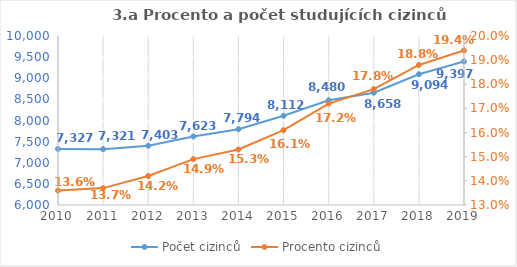
| Category | Počet cizinců |
|---|---|
| 2010.0 | 7327 |
| 2011.0 | 7321 |
| 2012.0 | 7403 |
| 2013.0 | 7623 |
| 2014.0 | 7794 |
| 2015.0 | 8112 |
| 2016.0 | 8480 |
| 2017.0 | 8658 |
| 2018.0 | 9094 |
| 2019.0 | 9397 |